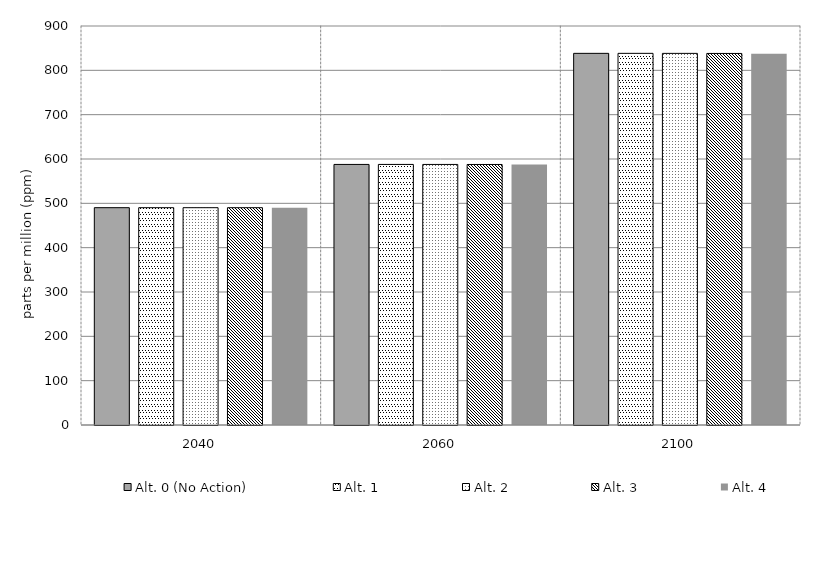
| Category | Alt. 0 (No Action) | Alt. 1 | Alt. 2 | Alt. 3 | Alt. 4 | Alt 5 | Alt 6 | Alt 7 | Alt 8 | Alt 10 |
|---|---|---|---|---|---|---|---|---|---|---|
| 2040.0 | 490.191 | 490.183 | 490.176 | 490.161 | 490.113 |  |  |  |  |  |
| 2060.0 | 587.756 | 587.75 | 587.723 | 587.659 | 587.477 |  |  |  |  |  |
| 2100.0 | 838.312 | 838.316 | 838.249 | 838.08 | 837.633 |  |  |  |  |  |